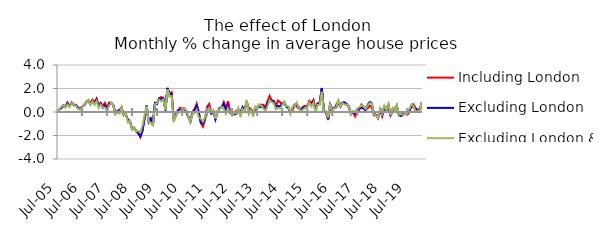
| Category | Including London | Excluding London | Excluding London & SE |
|---|---|---|---|
| 2005-07-01 | 0.014 | -0.006 | 0.09 |
| 2005-08-01 | 0.163 | 0.204 | 0.162 |
| 2005-09-01 | 0.324 | 0.325 | 0.462 |
| 2005-10-01 | 0.577 | 0.533 | 0.574 |
| 2005-11-01 | 0.466 | 0.417 | 0.391 |
| 2005-12-01 | 0.812 | 0.711 | 0.637 |
| 2006-01-01 | 0.5 | 0.49 | 0.413 |
| 2006-02-01 | 0.828 | 0.794 | 0.795 |
| 2006-03-01 | 0.563 | 0.637 | 0.633 |
| 2006-04-01 | 0.621 | 0.57 | 0.521 |
| 2006-05-01 | 0.386 | 0.352 | 0.256 |
| 2006-06-01 | 0.291 | 0.226 | 0.232 |
| 2006-07-01 | 0.438 | 0.412 | 0.342 |
| 2006-08-01 | 0.591 | 0.577 | 0.661 |
| 2006-09-01 | 0.848 | 0.81 | 0.786 |
| 2006-10-01 | 0.979 | 1.005 | 1.049 |
| 2006-11-01 | 0.775 | 0.651 | 0.593 |
| 2006-12-01 | 1.037 | 0.905 | 0.892 |
| 2007-01-01 | 0.858 | 0.697 | 0.609 |
| 2007-02-01 | 1.157 | 1.043 | 0.936 |
| 2007-03-01 | 0.591 | 0.493 | 0.34 |
| 2007-04-01 | 0.791 | 0.71 | 0.625 |
| 2007-05-01 | 0.495 | 0.385 | 0.394 |
| 2007-06-01 | 0.773 | 0.572 | 0.376 |
| 2007-07-01 | 0.314 | 0.122 | 0.088 |
| 2007-08-01 | 0.802 | 0.688 | 0.543 |
| 2007-09-01 | 0.779 | 0.781 | 0.791 |
| 2007-10-01 | 0.566 | 0.59 | 0.551 |
| 2007-11-01 | -0.121 | -0.088 | -0.213 |
| 2007-12-01 | 0.07 | 0.05 | -0.02 |
| 2008-01-01 | 0.193 | 0.09 | -0.129 |
| 2008-02-01 | 0.407 | 0.326 | 0.403 |
| 2008-03-01 | -0.27 | -0.262 | -0.309 |
| 2008-04-01 | -0.198 | -0.21 | -0.151 |
| 2008-05-01 | -0.666 | -0.685 | -0.88 |
| 2008-06-01 | -0.763 | -0.783 | -0.746 |
| 2008-07-01 | -1.456 | -1.471 | -1.501 |
| 2008-08-01 | -1.333 | -1.353 | -1.313 |
| 2008-09-01 | -1.666 | -1.602 | -1.648 |
| 2008-10-01 | -1.827 | -1.811 | -1.607 |
| 2008-11-01 | -2.152 | -2.056 | -1.731 |
| 2008-12-01 | -1.511 | -1.621 | -1.176 |
| 2009-01-01 | -0.593 | -0.517 | -0.245 |
| 2009-02-01 | 0.356 | 0.548 | 0.469 |
| 2009-03-01 | -0.862 | -0.838 | -0.892 |
| 2009-04-01 | -0.536 | -0.573 | -0.91 |
| 2009-05-01 | -0.786 | -1.169 | -1.113 |
| 2009-06-01 | 0.762 | 0.765 | 0.654 |
| 2009-07-01 | 0.77 | 0.668 | 0.757 |
| 2009-08-01 | 1.139 | 1.168 | 1.057 |
| 2009-09-01 | 1.284 | 1.066 | 0.915 |
| 2009-10-01 | 1.145 | 1.185 | 1.057 |
| 2009-11-01 | 0.204 | 0.132 | 0.175 |
| 2009-12-01 | 1.994 | 2.051 | 1.926 |
| 2010-01-01 | 1.536 | 1.399 | 1.297 |
| 2010-02-01 | 1.676 | 1.521 | 1.369 |
| 2010-03-01 | -0.651 | -0.718 | -0.827 |
| 2010-04-01 | -0.343 | -0.254 | -0.294 |
| 2010-05-01 | 0.049 | 0.144 | -0.074 |
| 2010-06-01 | 0.354 | 0.167 | 0.091 |
| 2010-07-01 | 0.283 | 0.116 | -0.045 |
| 2010-08-01 | 0.323 | 0.246 | 0.282 |
| 2010-09-01 | -0.047 | 0.051 | 0.181 |
| 2010-10-01 | -0.391 | -0.428 | -0.388 |
| 2010-11-01 | -0.701 | -0.847 | -0.825 |
| 2010-12-01 | 0.034 | -0.13 | -0.156 |
| 2011-01-01 | 0.244 | 0.162 | -0.115 |
| 2011-02-01 | 0.703 | 0.521 | 0.199 |
| 2011-03-01 | 0.059 | -0.093 | -0.469 |
| 2011-04-01 | -0.947 | -0.896 | -0.555 |
| 2011-05-01 | -1.241 | -0.98 | -0.829 |
| 2011-06-01 | -0.69 | -0.549 | -0.431 |
| 2011-07-01 | 0.458 | 0.212 | 0.054 |
| 2011-08-01 | 0.687 | 0.448 | 0.361 |
| 2011-09-01 | -0.023 | -0.142 | -0.013 |
| 2011-10-01 | 0.118 | 0.024 | 0.154 |
| 2011-11-01 | -0.58 | -0.635 | -0.549 |
| 2011-12-01 | 0.04 | -0.052 | 0.097 |
| 2012-01-01 | 0.333 | 0.333 | 0.235 |
| 2012-02-01 | 0.371 | 0.455 | 0.454 |
| 2012-03-01 | 0.836 | 0.719 | 0.266 |
| 2012-04-01 | 0.354 | 0.041 | -0.17 |
| 2012-05-01 | 0.924 | 0.531 | 0.33 |
| 2012-06-01 | -0.009 | -0.088 | -0.008 |
| 2012-07-01 | -0.101 | -0.157 | -0.313 |
| 2012-08-01 | -0.222 | -0.149 | -0.056 |
| 2012-09-01 | 0.107 | -0.167 | -0.111 |
| 2012-10-01 | 0.182 | 0.18 | 0.355 |
| 2012-11-01 | 0.049 | -0.244 | -0.405 |
| 2012-12-01 | 0.313 | 0.4 | 0.24 |
| 2013-01-01 | 0.306 | 0.087 | 0.068 |
| 2013-02-01 | 0.812 | 0.894 | 1.028 |
| 2013-03-01 | 0.345 | 0.054 | -0.185 |
| 2013-04-01 | 0.271 | 0.195 | 0.178 |
| 2013-05-01 | -0.069 | -0.184 | -0.413 |
| 2013-06-01 | 0.154 | 0.189 | 0.469 |
| 2013-07-01 | 0.387 | 0.362 | 0.318 |
| 2013-08-01 | 0.627 | 0.449 | 0.637 |
| 2013-09-01 | 0.614 | 0.397 | 0.507 |
| 2013-10-01 | 0.608 | 0.414 | 0.301 |
| 2013-11-01 | 0.433 | 0.181 | 0.067 |
| 2013-12-01 | 0.932 | 0.793 | 0.508 |
| 2014-01-01 | 1.371 | 1.039 | 1.01 |
| 2014-02-01 | 0.968 | 0.974 | 0.843 |
| 2014-03-01 | 0.953 | 0.835 | 0.729 |
| 2014-04-01 | 0.53 | 0.345 | 0.232 |
| 2014-05-01 | 0.977 | 0.529 | 0.368 |
| 2014-06-01 | 0.841 | 0.457 | 0.28 |
| 2014-07-01 | 0.675 | 0.715 | 0.55 |
| 2014-08-01 | 0.759 | 0.82 | 0.894 |
| 2014-09-01 | 0.533 | 0.443 | 0.501 |
| 2014-10-01 | 0.322 | 0.36 | 0.496 |
| 2014-11-01 | -0.008 | -0.021 | -0.17 |
| 2014-12-01 | 0.156 | 0.384 | 0.434 |
| 2015-01-01 | 0.598 | 0.617 | 0.551 |
| 2015-02-01 | 0.48 | 0.685 | 0.811 |
| 2015-03-01 | 0.272 | 0.423 | 0.331 |
| 2015-04-01 | 0.21 | 0.118 | 0.074 |
| 2015-05-01 | 0.449 | 0.351 | 0.211 |
| 2015-06-01 | 0.537 | 0.353 | 0.352 |
| 2015-07-01 | 0.463 | 0.465 | 0.426 |
| 2015-08-01 | 0.947 | 0.741 | 0.809 |
| 2015-09-01 | 0.767 | 0.655 | 0.494 |
| 2015-10-01 | 1.027 | 0.909 | 0.799 |
| 2015-11-01 | 0.191 | 0.085 | -0.057 |
| 2015-12-01 | 0.742 | 0.676 | 0.617 |
| 2016-01-01 | 0.805 | 0.681 | 0.612 |
| 2016-02-01 | 2.049 | 1.995 | 1.717 |
| 2016-03-01 | 0.139 | 0.043 | 0.039 |
| 2016-04-01 | -0.033 | 0.019 | 0.047 |
| 2016-05-01 | -0.677 | -0.587 | -0.483 |
| 2016-06-01 | 0.364 | 0.673 | 0.627 |
| 2016-07-01 | 0.169 | 0.309 | 0.195 |
| 2016-08-01 | 0.3 | 0.345 | 0.303 |
| 2016-09-01 | 0.633 | 0.377 | 0.395 |
| 2016-10-01 | 0.948 | 0.834 | 1.008 |
| 2016-11-01 | 0.616 | 0.446 | 0.473 |
| 2016-12-01 | 0.749 | 0.812 | 0.741 |
| 2017-01-01 | 0.808 | 0.802 | 0.649 |
| 2017-02-01 | 0.604 | 0.688 | 0.644 |
| 2017-03-01 | 0.501 | 0.389 | 0.426 |
| 2017-04-01 | -0.081 | -0.197 | -0.192 |
| 2017-05-01 | -0.038 | 0.018 | 0.084 |
| 2017-06-01 | -0.387 | -0.117 | -0.018 |
| 2017-07-01 | -0.049 | 0.194 | 0.262 |
| 2017-08-01 | 0.161 | 0.324 | 0.42 |
| 2017-09-01 | 0.631 | 0.378 | 0.54 |
| 2017-10-01 | 0.465 | 0.291 | 0.497 |
| 2017-11-01 | 0.38 | 0.138 | 0.262 |
| 2017-12-01 | 0.306 | 0.611 | 0.544 |
| 2018-01-01 | 0.546 | 0.845 | 0.735 |
| 2018-02-01 | 0.383 | 0.778 | 0.741 |
| 2018-03-01 | -0.286 | -0.128 | -0.179 |
| 2018-04-01 | -0.269 | -0.244 | -0.297 |
| 2018-05-01 | -0.322 | -0.529 | -0.491 |
| 2018-06-01 | 0.146 | 0.189 | 0.303 |
| 2018-07-01 | -0.37 | -0.221 | -0.081 |
| 2018-08-01 | 0.285 | 0.453 | 0.544 |
| 2018-09-01 | 0.297 | 0.134 | 0.197 |
| 2018-10-01 | 0.665 | 0.476 | 0.595 |
| 2018-11-01 | -0.272 | -0.333 | -0.287 |
| 2018-12-01 | 0.184 | 0.251 | 0.338 |
| 2019-01-01 | 0.192 | 0.263 | 0.162 |
| 2019-02-01 | 0.441 | 0.567 | 0.589 |
| 2019-03-01 | -0.286 | -0.228 | -0.221 |
| 2019-04-01 | -0.253 | -0.338 | -0.182 |
| 2019-05-01 | -0.049 | -0.264 | -0.241 |
| 2019-06-01 | -0.065 | -0.051 | -0.148 |
| 2019-07-01 | -0.242 | 0.004 | 0.035 |
| 2019-08-01 | -0.028 | 0.148 | 0.254 |
| 2019-09-01 | 0.569 | 0.444 | 0.653 |
| 2019-10-01 | 0.66 | 0.482 | 0.513 |
| 2019-11-01 | 0.35 | 0.139 | 0.018 |
| 2019-12-01 | 0.155 | 0.167 | 0.089 |
| 2020-01-01 | 0.258 | 0.221 | 0.128 |
| 2020-02-01 | 0.578 | 0.84 | 0.845 |
| 2020-03-01 | -0.265 | -0.273 | -0.638 |
| 2020-04-01 | -1.192 | -1.03 | -1.176 |